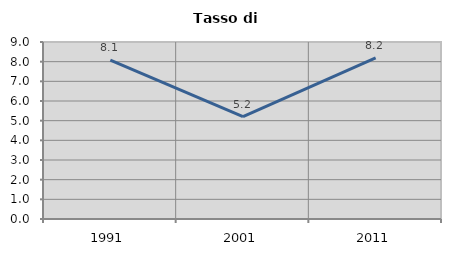
| Category | Tasso di disoccupazione   |
|---|---|
| 1991.0 | 8.078 |
| 2001.0 | 5.208 |
| 2011.0 | 8.196 |